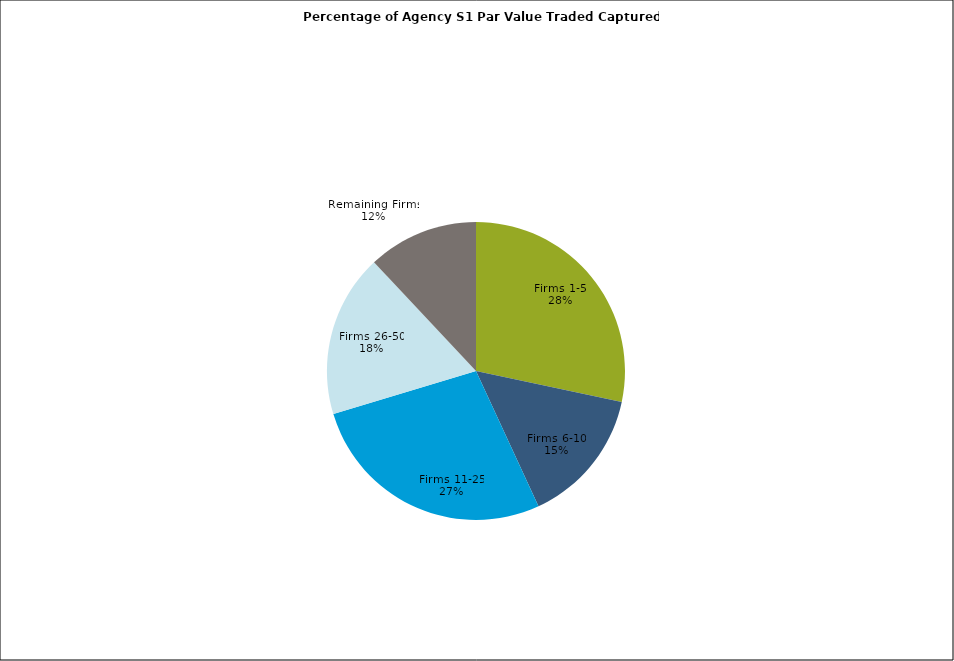
| Category | Series 0 |
|---|---|
| Firms 1-5 | 0.283 |
| Firms 6-10 | 0.148 |
| Firms 11-25 | 0.272 |
| Firms 26-50 | 0.177 |
| Remaining Firms | 0.12 |